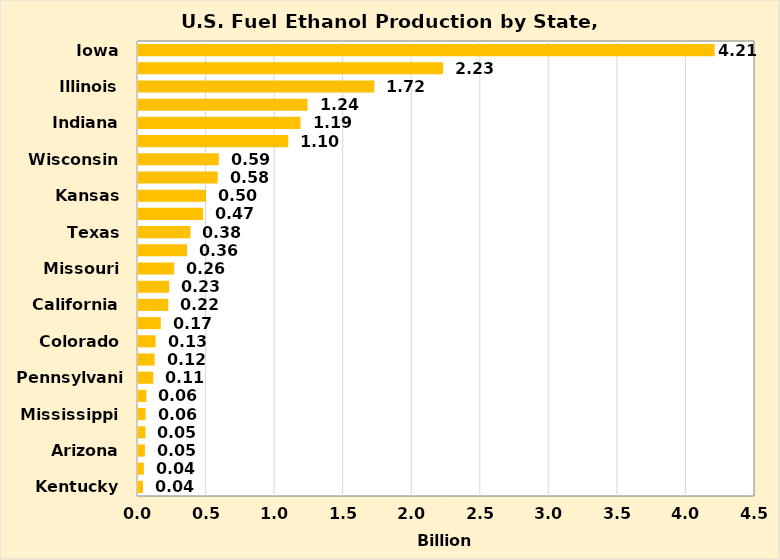
| Category | Series 0 |
|---|---|
| Kentucky | 0.036 |
| Oregon | 0.042 |
| Arizona | 0.051 |
| Virginia | 0.055 |
| Mississippi | 0.055 |
| Idaho | 0.061 |
| Pennsylvania | 0.111 |
| Georgia | 0.121 |
| Colorado | 0.128 |
| New York | 0.166 |
| California | 0.221 |
| Tennessee | 0.227 |
| Missouri | 0.264 |
| Michigan | 0.357 |
| Texas | 0.382 |
| North Dakota | 0.475 |
| Kansas | 0.496 |
| Ohio | 0.581 |
| Wisconsin | 0.589 |
| South Dakota | 1.096 |
| Indiana | 1.185 |
| Minnesota | 1.237 |
| Illinois | 1.723 |
| Nebraska | 2.225 |
| Iowa | 4.205 |